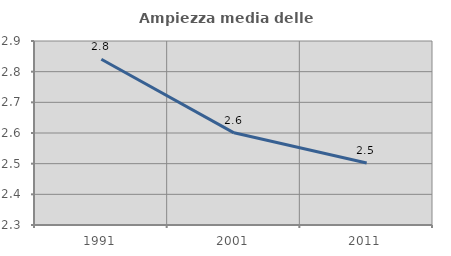
| Category | Ampiezza media delle famiglie |
|---|---|
| 1991.0 | 2.841 |
| 2001.0 | 2.601 |
| 2011.0 | 2.502 |